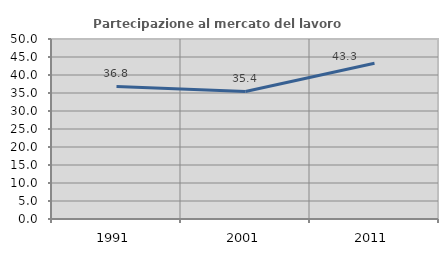
| Category | Partecipazione al mercato del lavoro  femminile |
|---|---|
| 1991.0 | 36.82 |
| 2001.0 | 35.424 |
| 2011.0 | 43.289 |